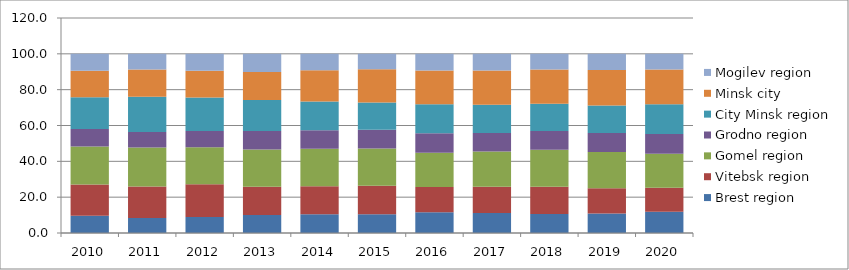
| Category | Brest region | Vitebsk region | Gomel region | Grodno region | City Minsk region | Minsk city | Mogilev region |
|---|---|---|---|---|---|---|---|
| 0 | 9.6 | 17.5 | 21.2 | 9.7 | 17.8 | 14.7 | 9.5 |
| 1 | 8.4 | 17.5 | 21.8 | 8.7 | 19.6 | 15.2 | 8.8 |
| 2 | 9 | 18.2 | 20.6 | 9.2 | 18.6 | 14.9 | 9.5 |
| 3 | 10 | 15.8 | 20.8 | 10.3 | 17.3 | 15.7 | 10.1 |
| 4 | 10.4 | 15.7 | 20.9 | 10.4 | 16 | 17.5 | 9.1 |
| 5 | 10.5 | 15.9 | 20.8 | 10.4 | 15.3 | 18.5 | 8.6 |
| 6 | 11.6 | 14.1 | 19.1 | 10.9 | 16.1 | 18.9 | 9.3 |
| 7 | 11.2 | 14.6 | 19.7 | 10.3 | 15.8 | 19.1 | 9.3 |
| 8 | 10.6 | 15.2 | 20.6 | 10.5 | 15.3 | 19.1 | 8.7 |
| 9 | 10.9 | 14.1 | 20.2 | 10.6 | 15.3 | 19.9 | 9 |
| 10 | 11.9 | 13.4 | 19 | 11 | 16.5 | 19.5 | 8.7 |